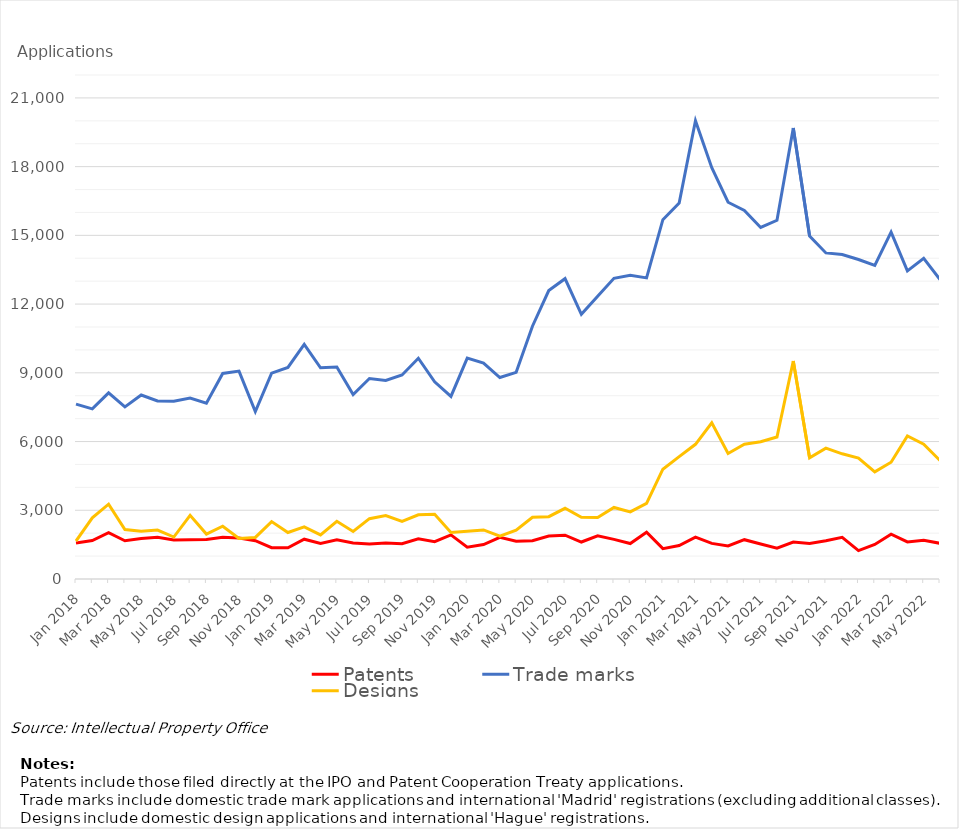
| Category | Patents | Trade marks | Designs |
|---|---|---|---|
| Jan 2018 | 1575 | 7634 | 1658 |
| Feb 2018 | 1676 | 7428 | 2672 |
| Mar 2018 | 2022 | 8127 | 3267 |
| Apr 2018 | 1670 | 7512 | 2160 |
| May 2018 | 1767 | 8030 | 2083 |
| Jun 2018 | 1821 | 7769 | 2136 |
| Jul 2018 | 1704 | 7757 | 1832 |
| Aug 2018 | 1713 | 7897 | 2777 |
| Sep 2018 | 1725 | 7673 | 1960 |
| Oct 2018 | 1818 | 8972 | 2302 |
| Nov 2018 | 1787 | 9076 | 1765 |
| Dec 2018 | 1670 | 7304 | 1815 |
| Jan 2019 | 1367 | 8985 | 2505 |
| Feb 2019 | 1361 | 9234 | 2031 |
| Mar 2019 | 1737 | 10243 | 2274 |
| Apr 2019 | 1552 | 9219 | 1923 |
| May 2019 | 1710 | 9251 | 2520 |
| Jun 2019 | 1569 | 8053 | 2074 |
| Jul 2019 | 1527 | 8752 | 2634 |
| Aug 2019 | 1571 | 8670 | 2768 |
| Sep 2019 | 1540 | 8907 | 2511 |
| Oct 2019 | 1755 | 9636 | 2800 |
| Nov 2019 | 1630 | 8607 | 2827 |
| Dec 2019 | 1926 | 7970 | 2028 |
| Jan 2020 | 1391 | 9642 | 2082 |
| Feb 2020 | 1504 | 9428 | 2143 |
| Mar 2020 | 1819 | 8794 | 1872 |
| Apr 2020 | 1648 | 9021 | 2127 |
| May 2020 | 1672 | 11035 | 2695 |
| Jun 2020 | 1879 | 12593 | 2721 |
| Jul 2020 | 1912 | 13110 | 3086 |
| Aug 2020 | 1614 | 11551 | 2694 |
| Sep 2020 | 1885 | 12340 | 2686 |
| Oct 2020 | 1730 | 13126 | 3124 |
| Nov 2020 | 1547 | 13254 | 2930 |
| Dec 2020 | 2042 | 13144 | 3302 |
| Jan 2021 | 1324 | 15685 | 4792 |
| Feb 2021 | 1462 | 16412 | 5340 |
| Mar 2021 | 1828 | 20001 | 5879 |
| Apr 2021 | 1554 | 17951 | 6815 |
| May 2021 | 1446 | 16446 | 5480 |
| Jun 2021 | 1716 | 16091 | 5881 |
| Jul 2021 | 1528 | 15345 | 5989 |
| Aug 2021 | 1344 | 15659 | 6200 |
| Sep 2021 | 1614 | 19685 | 9518 |
| Oct 2021 | 1547 | 14968 | 5289 |
| Nov 2021 | 1670 | 14233 | 5712 |
| Dec 2021 | 1817 | 14162 | 5464 |
| Jan 2022 | 1241 | 13945 | 5282 |
| Feb 2022 | 1507 | 13690 | 4679 |
| Mar 2022 | 1953 | 15141 | 5097 |
| Apr 2022 | 1618 | 13449 | 6247 |
| May 2022 | 1688 | 13993 | 5888 |
| June 2022 | 1558 | 13074 | 5172 |